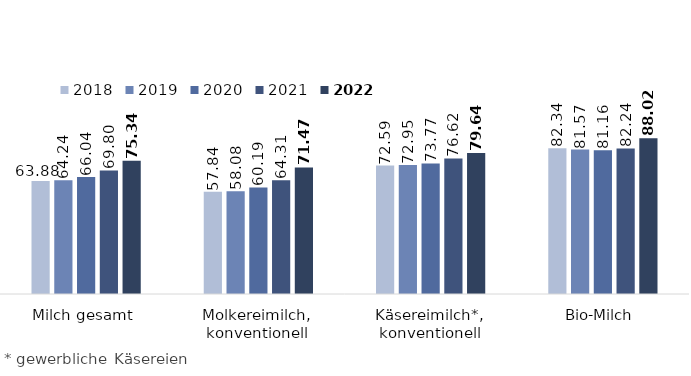
| Category | 2018 | 2019 | 2020 | 2021 | 2022 |
|---|---|---|---|---|---|
| Milch gesamt | 63.88 | 64.237 | 66.043 | 69.798 | 75.342 |
| Molkereimilch, konventionell | 57.837 | 58.081 | 60.187 | 64.31 | 71.475 |
| Käsereimilch*, konventionell | 72.592 | 72.945 | 73.769 | 76.62 | 79.64 |
| Bio-Milch | 82.343 | 81.574 | 81.157 | 82.24 | 88.024 |